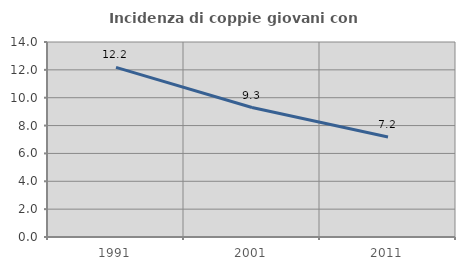
| Category | Incidenza di coppie giovani con figli |
|---|---|
| 1991.0 | 12.176 |
| 2001.0 | 9.294 |
| 2011.0 | 7.181 |